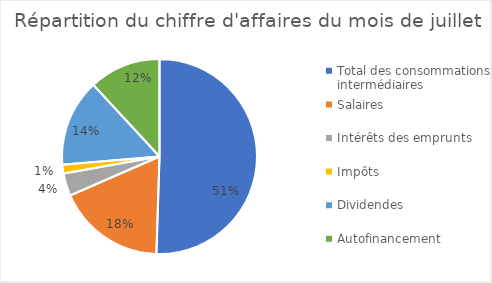
| Category | Series 0 |
|---|---|
| Total des consommations intermédiaires | 872800 |
| Salaires | 310000 |
| Intérêts des emprunts | 65000 |
| Impôts | 25000 |
| Dividendes | 250000 |
| Autofinancement | 205200 |